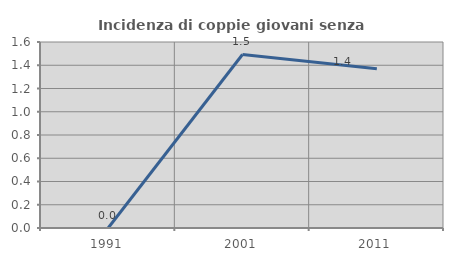
| Category | Incidenza di coppie giovani senza figli |
|---|---|
| 1991.0 | 0 |
| 2001.0 | 1.493 |
| 2011.0 | 1.37 |